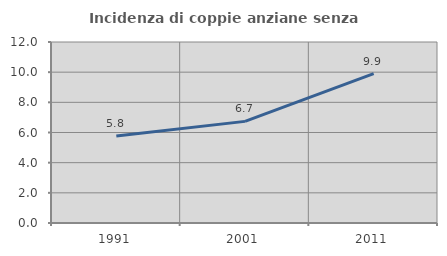
| Category | Incidenza di coppie anziane senza figli  |
|---|---|
| 1991.0 | 5.765 |
| 2001.0 | 6.738 |
| 2011.0 | 9.901 |